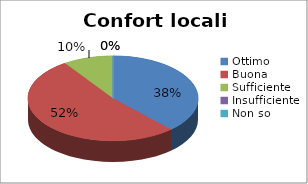
| Category | Confort locali prelievi |
|---|---|
| Ottimo | 8 |
| Buona | 11 |
| Sufficiente | 2 |
| Insufficiente | 0 |
| Non so | 0 |